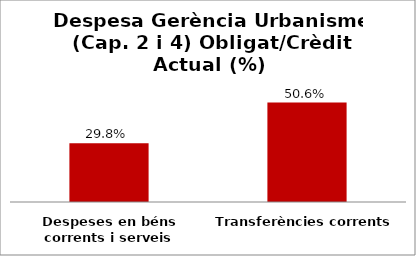
| Category | Series 0 |
|---|---|
| Despeses en béns corrents i serveis | 0.298 |
| Transferències corrents | 0.506 |